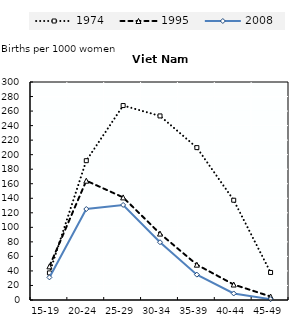
| Category | 1974 | 1995 | 2008 |
|---|---|---|---|
| 15-19 | 37.3 | 46.3 | 31.1 |
| 20-24 | 191.7 | 164.2 | 125.2 |
| 25-29 | 267.6 | 141.2 | 130.8 |
| 30-34 | 253.3 | 91.4 | 79.5 |
| 35-39 | 209.7 | 48.6 | 34.9 |
| 40-44 | 137.3 | 21.3 | 9 |
| 45-49 | 37.9 | 4.8 | 1.1 |